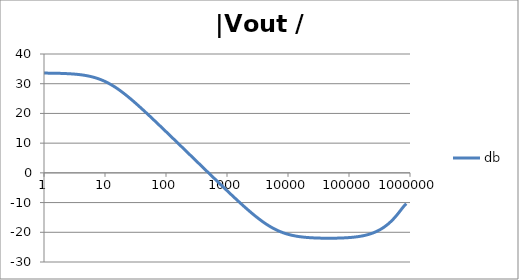
| Category | db |
|---|---|
| 1.0 | 33.576 |
| 1.0715193052376064 | 33.57 |
| 1.1481536214968828 | 33.563 |
| 1.2302687708123814 | 33.556 |
| 1.318256738556407 | 33.547 |
| 1.4125375446227544 | 33.536 |
| 1.513561248436208 | 33.525 |
| 1.6218100973589298 | 33.511 |
| 1.7378008287493754 | 33.496 |
| 1.8620871366628673 | 33.478 |
| 1.9952623149688797 | 33.458 |
| 2.1379620895022318 | 33.435 |
| 2.2908676527677727 | 33.409 |
| 2.45470891568503 | 33.379 |
| 2.6302679918953817 | 33.345 |
| 2.8183829312644537 | 33.306 |
| 3.0199517204020156 | 33.262 |
| 3.235936569296282 | 33.212 |
| 3.467368504525316 | 33.155 |
| 3.7153522909717256 | 33.091 |
| 3.9810717055349727 | 33.018 |
| 4.265795188015926 | 32.936 |
| 4.570881896148749 | 32.844 |
| 4.897788193684462 | 32.74 |
| 5.2480746024977245 | 32.624 |
| 5.62341325190349 | 32.494 |
| 6.025595860743575 | 32.35 |
| 6.456542290346554 | 32.191 |
| 6.918309709189363 | 32.014 |
| 7.4131024130091765 | 31.82 |
| 7.943282347242814 | 31.607 |
| 8.511380382023765 | 31.375 |
| 9.120108393559095 | 31.123 |
| 9.772372209558105 | 30.851 |
| 10.47128548050899 | 30.558 |
| 11.22018454301963 | 30.244 |
| 12.022644346174127 | 29.91 |
| 12.88249551693134 | 29.556 |
| 13.803842646028851 | 29.181 |
| 14.791083881682074 | 28.788 |
| 15.848931924611136 | 28.377 |
| 16.98243652461744 | 27.948 |
| 18.197008586099834 | 27.502 |
| 19.498445997580447 | 27.042 |
| 20.892961308540382 | 26.567 |
| 22.387211385683386 | 26.079 |
| 23.988329190194897 | 25.579 |
| 25.703957827688622 | 25.067 |
| 27.54228703338165 | 24.546 |
| 29.51209226666385 | 24.016 |
| 31.62277660168379 | 23.478 |
| 33.884415613920254 | 22.933 |
| 36.307805477010106 | 22.381 |
| 38.90451449942804 | 21.824 |
| 41.686938347033525 | 21.261 |
| 44.6683592150963 | 20.694 |
| 47.86300923226381 | 20.122 |
| 51.28613839913647 | 19.547 |
| 54.95408738576247 | 18.97 |
| 58.88436553555889 | 18.389 |
| 63.09573444801931 | 17.806 |
| 67.60829753919813 | 17.221 |
| 72.44359600749901 | 16.633 |
| 77.62471166286915 | 16.045 |
| 83.17637711026705 | 15.455 |
| 89.12509381337456 | 14.863 |
| 95.49925860214357 | 14.271 |
| 102.32929922807544 | 13.678 |
| 109.64781961431841 | 13.083 |
| 117.48975549395293 | 12.489 |
| 125.89254117941665 | 11.893 |
| 134.89628825916537 | 11.297 |
| 144.54397707459273 | 10.701 |
| 154.88166189124806 | 10.104 |
| 165.95869074375608 | 9.507 |
| 177.82794100389225 | 8.909 |
| 190.5460717963248 | 8.312 |
| 204.17379446695278 | 7.714 |
| 218.77616239495524 | 7.116 |
| 234.42288153199212 | 6.518 |
| 251.18864315095806 | 5.92 |
| 269.15348039269156 | 5.322 |
| 288.4031503126605 | 4.724 |
| 309.0295432513591 | 4.126 |
| 331.1311214825911 | 3.528 |
| 354.81338923357566 | 2.931 |
| 380.18939632056095 | 2.333 |
| 407.3802778041123 | 1.736 |
| 436.5158322401654 | 1.139 |
| 467.7351412871979 | 0.542 |
| 501.18723362727184 | -0.054 |
| 537.0317963702526 | -0.65 |
| 575.4399373371566 | -1.245 |
| 616.5950018614822 | -1.84 |
| 660.6934480075952 | -2.434 |
| 707.9457843841375 | -3.027 |
| 758.5775750291831 | -3.619 |
| 812.8305161640983 | -4.21 |
| 870.9635899560801 | -4.799 |
| 933.2543007969903 | -5.387 |
| 999.9999999999998 | -5.974 |
| 1071.5193052376057 | -6.558 |
| 1148.1536214968828 | -7.141 |
| 1230.2687708123801 | -7.72 |
| 1318.2567385564053 | -8.297 |
| 1412.537544622753 | -8.871 |
| 1513.5612484362066 | -9.441 |
| 1621.8100973589292 | -10.006 |
| 1737.8008287493742 | -10.567 |
| 1862.0871366628671 | -11.123 |
| 1995.2623149688786 | -11.672 |
| 2137.9620895022326 | -12.215 |
| 2290.867652767771 | -12.75 |
| 2454.708915685027 | -13.277 |
| 2630.26799189538 | -13.795 |
| 2818.382931264451 | -14.302 |
| 3019.9517204020176 | -14.798 |
| 3235.9365692962774 | -15.281 |
| 3467.368504525316 | -15.751 |
| 3715.352290971724 | -16.206 |
| 3981.07170553497 | -16.645 |
| 4265.795188015923 | -17.068 |
| 4570.881896148745 | -17.473 |
| 4897.788193684463 | -17.859 |
| 5248.074602497726 | -18.226 |
| 5623.413251903489 | -18.573 |
| 6025.595860743574 | -18.9 |
| 6456.54229034655 | -19.206 |
| 6918.309709189357 | -19.491 |
| 7413.102413009165 | -19.756 |
| 7943.282347242815 | -20 |
| 8511.380382023763 | -20.225 |
| 9120.108393559092 | -20.43 |
| 9772.3722095581 | -20.617 |
| 10471.285480509003 | -20.787 |
| 11220.184543019639 | -20.94 |
| 12022.64434617411 | -21.078 |
| 12882.495516931338 | -21.202 |
| 13803.842646028841 | -21.312 |
| 14791.083881682063 | -21.411 |
| 15848.931924611119 | -21.498 |
| 16982.436524617453 | -21.575 |
| 18197.008586099837 | -21.643 |
| 19498.445997580417 | -21.703 |
| 20892.961308540387 | -21.755 |
| 22387.211385683382 | -21.801 |
| 23988.32919019488 | -21.84 |
| 25703.957827688606 | -21.874 |
| 27542.28703338167 | -21.903 |
| 29512.092266663854 | -21.928 |
| 31622.77660168378 | -21.948 |
| 33884.41561392023 | -21.964 |
| 36307.805477010166 | -21.977 |
| 38904.514499428085 | -21.987 |
| 41686.93834703348 | -21.994 |
| 44668.35921509631 | -21.997 |
| 47863.00923226382 | -21.998 |
| 51286.13839913646 | -21.995 |
| 54954.08738576241 | -21.99 |
| 58884.365535558936 | -21.981 |
| 63095.73444801934 | -21.969 |
| 67608.29753919817 | -21.954 |
| 72443.59600749899 | -21.935 |
| 77624.71166286913 | -21.912 |
| 83176.37711026703 | -21.884 |
| 89125.09381337445 | -21.851 |
| 95499.25860214363 | -21.813 |
| 102329.29922807543 | -21.769 |
| 109647.81961431848 | -21.718 |
| 117489.75549395289 | -21.659 |
| 125892.54117941685 | -21.592 |
| 134896.28825916522 | -21.515 |
| 144543.97707459255 | -21.427 |
| 154881.66189124787 | -21.328 |
| 165958.69074375575 | -21.215 |
| 177827.9410038922 | -21.087 |
| 190546.07179632425 | -20.944 |
| 204173.79446695274 | -20.782 |
| 218776.16239495497 | -20.6 |
| 234422.88153199226 | -20.396 |
| 251188.64315095753 | -20.169 |
| 269153.480392691 | -19.916 |
| 288403.15031266044 | -19.636 |
| 309029.5432513582 | -19.325 |
| 331131.1214825907 | -18.982 |
| 354813.3892335749 | -18.604 |
| 380189.3963205612 | -18.19 |
| 407380.2778041119 | -17.736 |
| 436515.8322401649 | -17.24 |
| 467735.14128719777 | -16.7 |
| 501187.2336272717 | -16.114 |
| 537031.7963702519 | -15.48 |
| 575439.9373371559 | -14.798 |
| 616595.001861482 | -14.07 |
| 660693.4480075944 | -13.301 |
| 707945.7843841374 | -12.507 |
| 758577.575029183 | -11.715 |
| 812830.5161640996 | -10.973 |
| 870963.5899560791 | -10.355 |